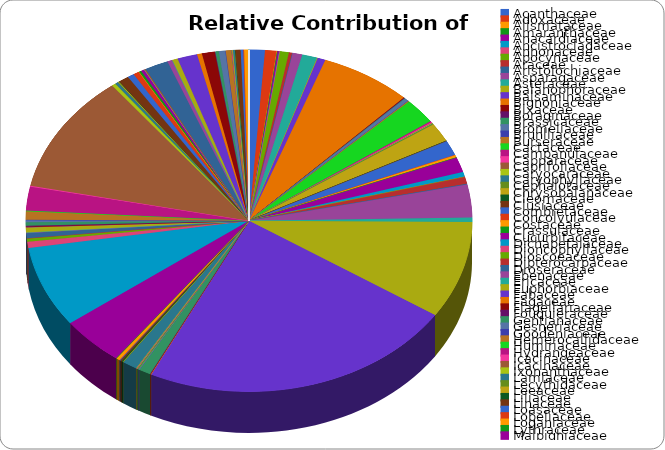
| Category | # Species w/ EFNs |
|---|---|
| Acanthaceae | 46 |
| Adoxaceae | 34 |
| Alismataceae | 1 |
| Amaranthaceae | 1 |
| Anacardiaceae | 5 |
| Ancistrocladaceae | 1 |
| Annonaceae | 1 |
| Apocynaceae | 26 |
| Araceae | 10 |
| Aristolochiaceae | 1 |
| Asparagaceae | 28 |
| Asteraceae | 44 |
| Balanophoraceae | 2 |
| Balsaminaceae | 23 |
| Bignoniaceae | 267 |
| Bixaceae | 2 |
| Boraginaceae | 2 |
| Brassicaceae | 1 |
| Bromeliaceae | 13 |
| Brunlliaceae | 0 |
| Burseraceae | 3 |
| Cactaceae | 96 |
| Campanulaceae | 4 |
| Capparaceae | 5 |
| Caprifoliaceae | 0 |
| Caryocaraceae | 2 |
| Caryophyllaceae | 2 |
| Cephalotaceae | 1 |
| Chrysobalanaceae | 72 |
| Cleomaceae | 1 |
| Clusiaceae | 1 |
| Combretaceae | 58 |
| Concolvulaceae | 0 |
| Costaceae | 9 |
| Crassulaceae | 1 |
| Cucurbitaceae | 56 |
| Dichapetalaceae | 19 |
| Dioncophyllaceae | 1 |
| Dioscoeaceae | 0 |
| Dipterocarpaceae | 26 |
| Droseraceae | 3 |
| Ebenaceae | 124 |
| Ericaceae | 17 |
| Euphorbiaceae | 369 |
| Fabaceae | 920 |
| Fagaceae | 2 |
| Flagellariaceae | 1 |
| Fouquieraceae | 1 |
| Gentianaceae | 34 |
| Gesneriaceae | 3 |
| Goodeniaceae | 1 |
| Hemerocallidaceae | 0 |
| Humiriaceae | 3 |
| Hydrangeaceae | 1 |
| Icacinaceae | 1 |
| Icacinaceae | 1 |
| Ixonanthaceae | 1 |
| Lamiaceae | 43 |
| Lecythidaceae | 2 |
| Leeaceae | 0 |
| Liliaceae | 4 |
| Linaceae | 5 |
| Loasaceae | 3 |
| Lobeliaceae | 0 |
| Loganiaceae | 10 |
| Lythraceae | 2 |
| Malpighiaceae | 186 |
| Malvaceae | 308 |
| Marantaceae | 24 |
| Marcgraviaceae | 13 |
| Melastomaceae | 0 |
| Meliaceae | 19 |
| Menispermaceae | 3 |
| Mimosaceae | 0 |
| Moraceae | 20 |
| Moringaceae | 0 |
| Musaceae | 1 |
| Myrsinaceae | 0 |
| Myrtaceae | 4 |
| Nepenthaceae | 13 |
| Ochnaceae | 8 |
| Olacaceae | 1 |
| Oleaceae | 32 |
| Onagraceae | 3 |
| Orchidaceae | 90 |
| Paeoniaceae | 4 |
| Passifloraceae | 450 |
| Pedaliaceae | 12 |
| Phyllanthaceae | 9 |
| Phytolaccaceae | 1 |
| Picramniaceae | 3 |
| Plumbaginaceae | 1 |
| Poaceae | 30 |
| Polygalaceae | 19 |
| Polygonaceae | 18 |
| Polypodiaceae | 0 |
| Primulaceae | 7 |
| Proteaceae | 10 |
| Punicaceae | 0 |
| Ranunculaceae | 1 |
| Rhamnaceae | 2 |
| Rhizophoraceae | 1 |
| Rosaceae | 69 |
| Rubiaceae | 15 |
| Ruscaceae | 0 |
| Rutaceae | 16 |
| Salicaceae | 58 |
| Sapindaceae | 14 |
| Sarraceniaceae | 38 |
| Saxifragaceae | 1 |
| Scrophulariaceae | 10 |
| Simaroubaceae | 20 |
| Smilacaceae | 0 |
| Solanaceae | 17 |
| Staphyleaceae | 1 |
| Sterculiaceae | 0 |
| Stylidiaceae | 1 |
| Styracaceae | 1 |
| Surianaceae | 1 |
| Thomasandersiaceae | 6 |
| Thymelaeaceae | 1 |
| Tiliaceae | 0 |
| Turneraceae | 0 |
| Verbenacaeae | 15 |
| Vitaceae | 8 |
| Violaceae | 2 |
| Vochysiaceae | 12 |
| Xanthorrhoeaceae | 2 |
| Zingiberaceae | 0 |